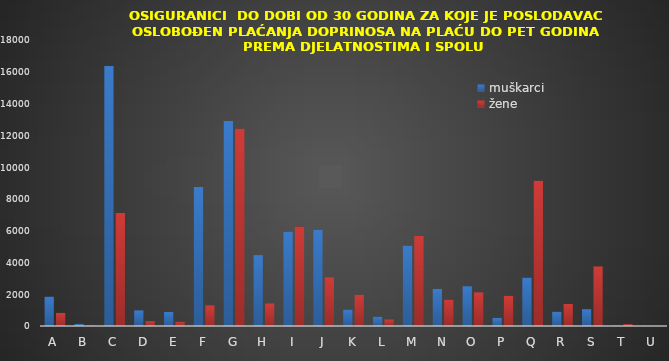
| Category | muškarci | žene |
|---|---|---|
| A | 1848 | 824 |
| B | 133 | 19 |
| C | 16366 | 7108 |
| D | 981 | 300 |
| E | 885 | 264 |
| F | 8743 | 1297 |
| G | 12897 | 12416 |
| H | 4461 | 1417 |
| I | 5946 | 6260 |
| J | 6062 | 3063 |
| K | 1032 | 1967 |
| L | 585 | 410 |
| M | 5064 | 5689 |
| N | 2336 | 1665 |
| O | 2500 | 2117 |
| P | 507 | 1898 |
| Q | 3048 | 9143 |
| R | 896 | 1390 |
| S | 1056 | 3746 |
| T | 21 | 114 |
| U | 9 | 9 |